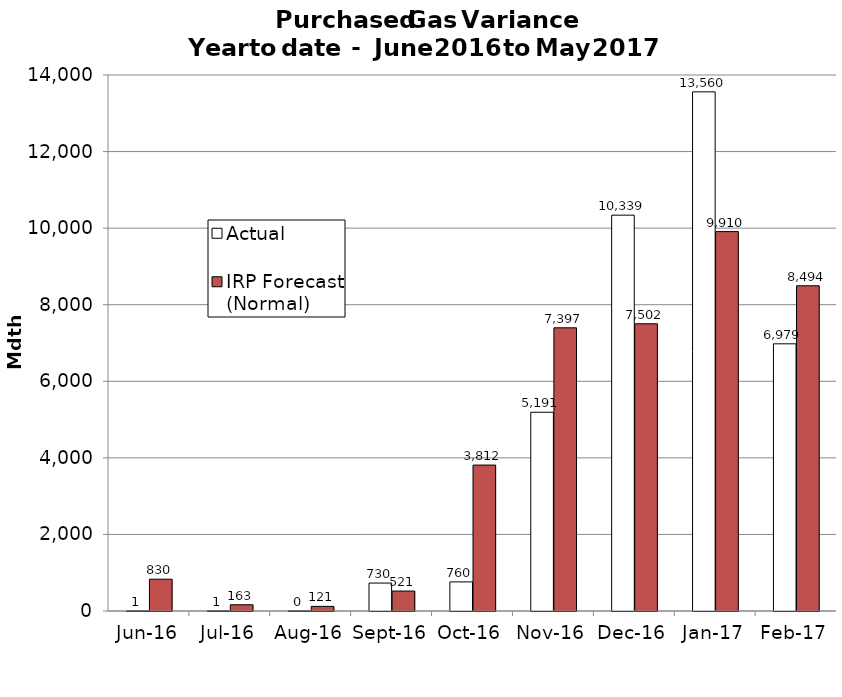
| Category | Actual | IRP Forecast (Normal) |
|---|---|---|
| 2016-06-01 | 0.748 | 830.276 |
| 2016-07-01 | 1.424 | 162.724 |
| 2016-08-01 | 0.132 | 120.631 |
| 2016-09-01 | 730 | 521.317 |
| 2016-10-01 | 760 | 3811.721 |
| 2016-11-01 | 5190.9 | 7397.057 |
| 2016-12-01 | 10338.923 | 7501.831 |
| 2017-01-01 | 13559.912 | 9909.749 |
| 2017-02-01 | 6978.71 | 8494.375 |